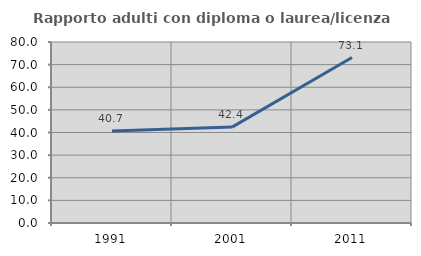
| Category | Rapporto adulti con diploma o laurea/licenza media  |
|---|---|
| 1991.0 | 40.698 |
| 2001.0 | 42.384 |
| 2011.0 | 73.139 |